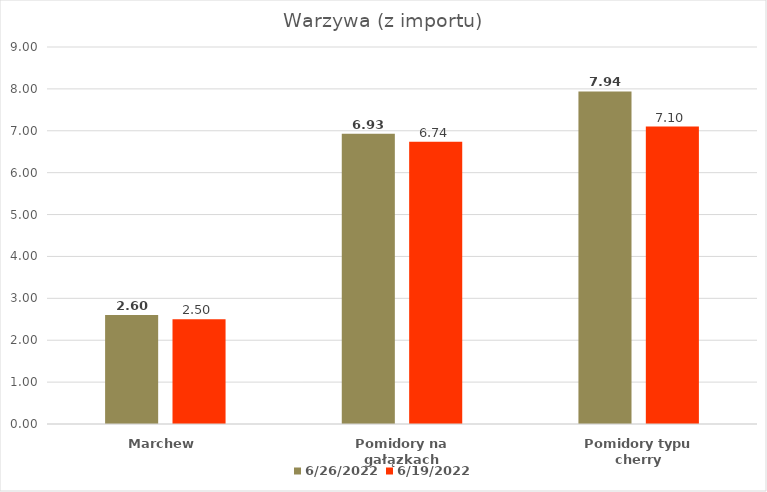
| Category | 26.06.2022 | 19.06.2022 |
|---|---|---|
| Marchew | 2.6 | 2.5 |
| Pomidory na gałązkach | 6.93 | 6.74 |
| Pomidory typu cherry | 7.94 | 7.1 |